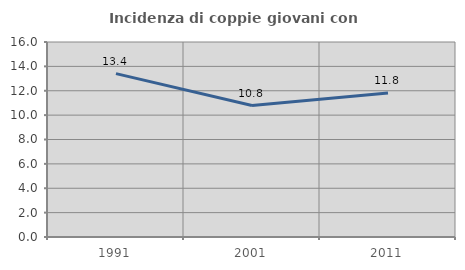
| Category | Incidenza di coppie giovani con figli |
|---|---|
| 1991.0 | 13.402 |
| 2001.0 | 10.784 |
| 2011.0 | 11.818 |